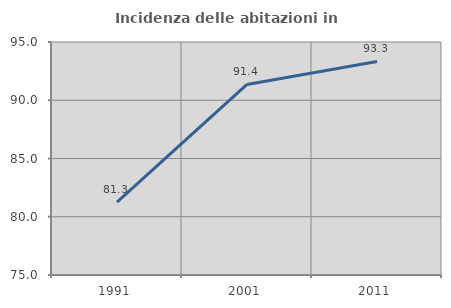
| Category | Incidenza delle abitazioni in proprietà  |
|---|---|
| 1991.0 | 81.25 |
| 2001.0 | 91.358 |
| 2011.0 | 93.333 |